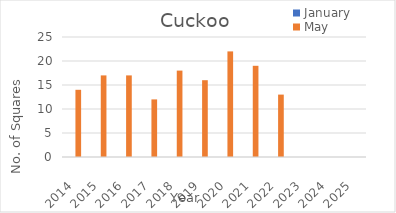
| Category | January | May |
|---|---|---|
| 2014.0 | 0 | 14 |
| 2015.0 | 0 | 17 |
| 2016.0 | 0 | 17 |
| 2017.0 | 0 | 12 |
| 2018.0 | 0 | 18 |
| 2019.0 | 0 | 16 |
| 2020.0 | 0 | 22 |
| 2021.0 | 0 | 19 |
| 2022.0 | 0 | 13 |
| 2023.0 | 0 | 0 |
| 2024.0 | 0 | 0 |
| 2025.0 | 0 | 0 |